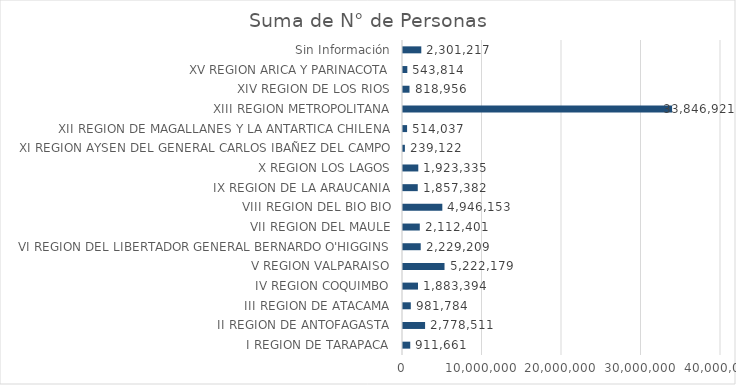
| Category | Series 0 |
|---|---|
|    I REGION DE TARAPACA | 911661 |
|   II REGION DE ANTOFAGASTA | 2778510.5 |
|  III REGION DE ATACAMA | 981784.1 |
|   IV REGION COQUIMBO | 1883393.8 |
|    V REGION VALPARAISO | 5222178.8 |
|   VI REGION DEL LIBERTADOR GENERAL BERNARDO O'HIGGINS | 2229209.2 |
|  VII REGION DEL MAULE | 2112400.5 |
| VIII REGION DEL BIO BIO | 4946153.3 |
|   IX REGION DE LA ARAUCANIA | 1857382.2 |
|    X REGION LOS LAGOS | 1923334.7 |
|   XI REGION AYSEN DEL GENERAL CARLOS IBAÑEZ DEL CAMPO | 239121.7 |
|  XII REGION DE MAGALLANES Y LA ANTARTICA CHILENA | 514036.7 |
| XIII REGION METROPOLITANA | 33846920.6 |
|  XIV REGION DE LOS RIOS | 818956.1 |
|   XV REGION ARICA Y PARINACOTA | 543813.5 |
| Sin Información | 2301217 |